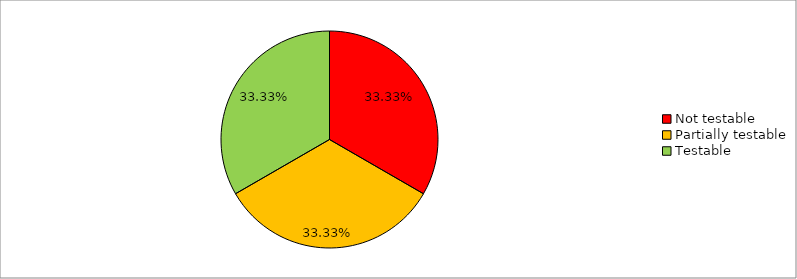
| Category | Series 0 |
|---|---|
| Not testable | 0.333 |
| Partially testable | 0.333 |
| Testable | 0.333 |